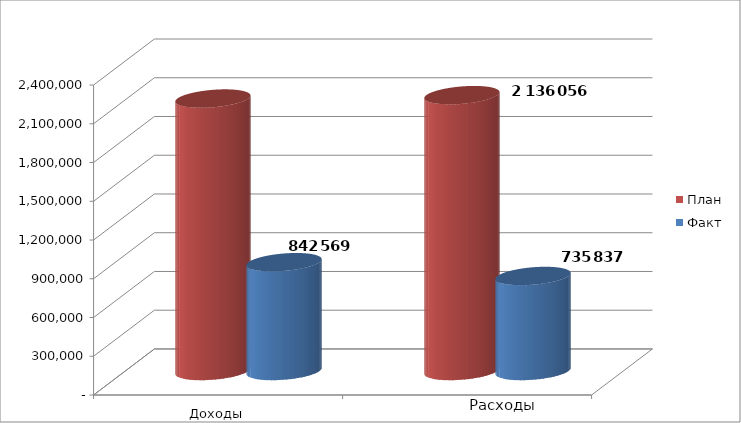
| Category | План | Факт |
|---|---|---|
| 0 | 2109651 | 842569 |
| 1 | 2136056 | 735836.5 |